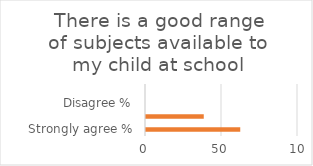
| Category | Series 1 |
|---|---|
| Strongly agree % | 62 |
| Agree % | 38 |
| Disagree % | 0 |
| Strongly disagree % | 0 |